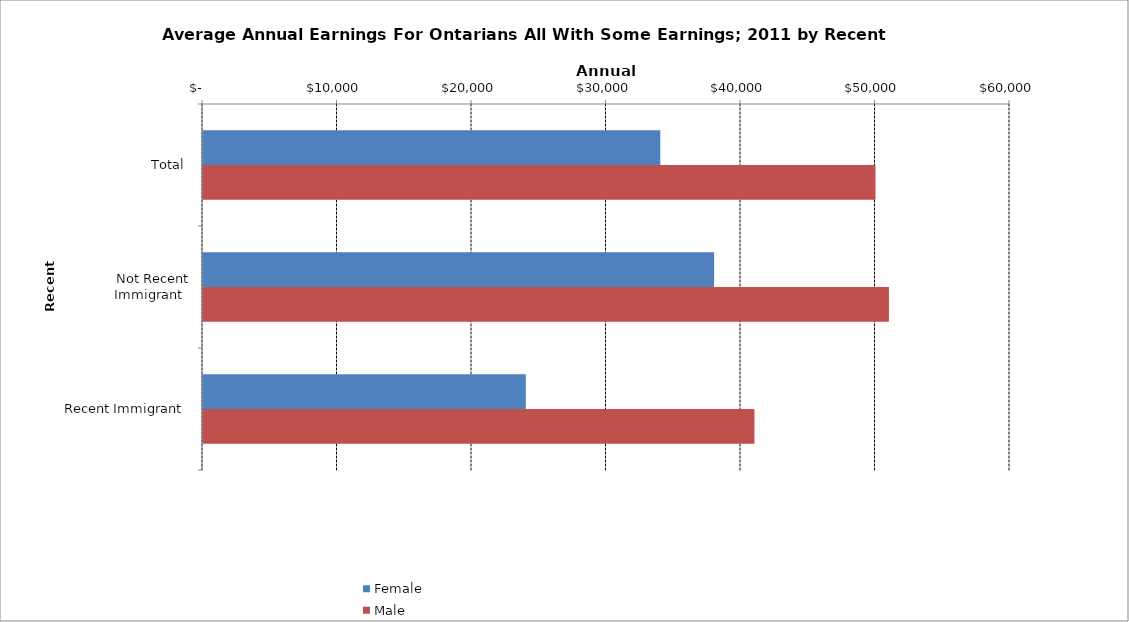
| Category | Female | Male |
|---|---|---|
| Total | 34000 | 50000 |
|  Not Recent Immigrant  | 38000 | 51000 |
|  Recent Immigrant  | 24000 | 41000 |